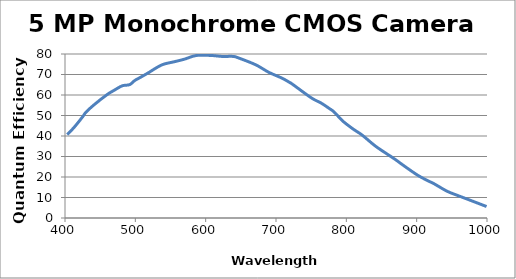
| Category | Quantum Efficiency (%) |
|---|---|
| 403.12 | 40.698 |
| 412.78 | 44.136 |
| 424.91 | 49.293 |
| 429.79 | 51.585 |
| 440.62 | 55.023 |
| 459.81 | 60.18 |
| 469.37 | 62.186 |
| 481.29 | 64.478 |
| 491.92 | 65.051 |
| 499.12 | 67.056 |
| 505.08 | 68.202 |
| 511.05 | 69.348 |
| 519.77 | 71.089 |
| 529.26 | 73.136 |
| 539.65 | 74.955 |
| 556.55 | 76.319 |
| 569.7 | 77.456 |
| 586.63 | 79.275 |
| 608.1 | 79.275 |
| 623.0 | 78.82 |
| 638.87 | 78.82 |
| 646.28 | 78.138 |
| 671.23 | 74.727 |
| 689.63 | 71.089 |
| 709.01 | 68.133 |
| 720.03 | 65.989 |
| 722.81 | 65.404 |
| 750.31 | 58.582 |
| 764.12 | 56.081 |
| 776.06 | 53.352 |
| 782.47 | 51.76 |
| 795.2 | 47.212 |
| 809.85 | 43.347 |
| 822.7 | 40.39 |
| 841.9 | 34.933 |
| 867.6 | 29.02 |
| 882.26 | 25.382 |
| 901.53 | 20.834 |
| 916.26 | 18.105 |
| 924.56 | 16.741 |
| 942.96 | 13.103 |
| 957.74 | 11.056 |
| 973.46 | 9.009 |
| 999.34 | 5.598 |